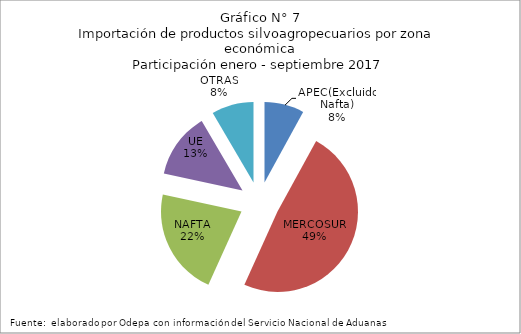
| Category | Series 0 |
|---|---|
| APEC(Excluido Nafta) | 342232.733 |
| MERCOSUR | 2094422.473 |
| NAFTA | 930167.519 |
| UE | 564170.76 |
| OTRAS | 362817.514 |